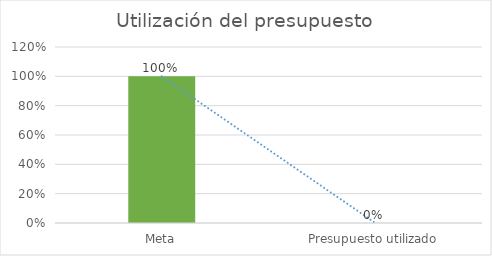
| Category | Series 0 |
|---|---|
| Meta | 1 |
| Presupuesto utilizado | 0 |